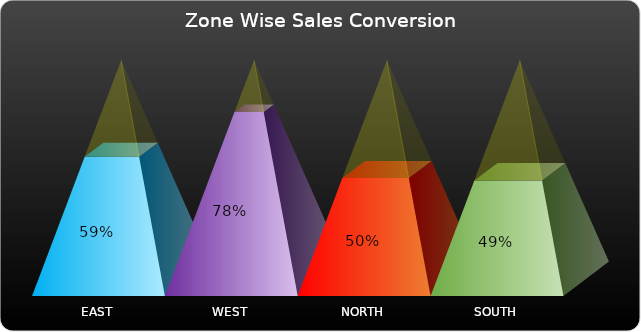
| Category | Sales Conversion% | Transparent Slice |
|---|---|---|
| EAST | 0.59 | 0.41 |
| WEST | 0.78 | 0.22 |
| NORTH | 0.5 | 0.5 |
| SOUTH | 0.49 | 0.51 |